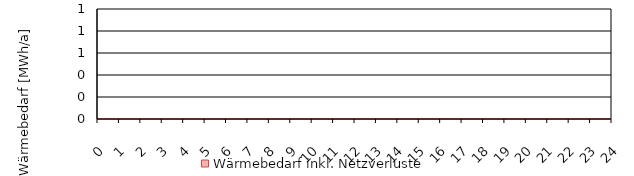
| Category | Wärmebedarf inkl. Netzverluste |
|---|---|
| 0.0 | 0 |
| 1.0 | 0 |
| 2.0 | 0 |
| 3.0 | 0 |
| 4.0 | 0 |
| 5.0 | 0 |
| 6.0 | 0 |
| 7.0 | 0 |
| 8.0 | 0 |
| 9.0 | 0 |
| 10.0 | 0 |
| 11.0 | 0 |
| 12.0 | 0 |
| 13.0 | 0 |
| 14.0 | 0 |
| 15.0 | 0 |
| 16.0 | 0 |
| 17.0 | 0 |
| 18.0 | 0 |
| 19.0 | 0 |
| 20.0 | 0 |
| 21.0 | 0 |
| 22.0 | 0 |
| 23.0 | 0 |
| 24.0 | 0 |